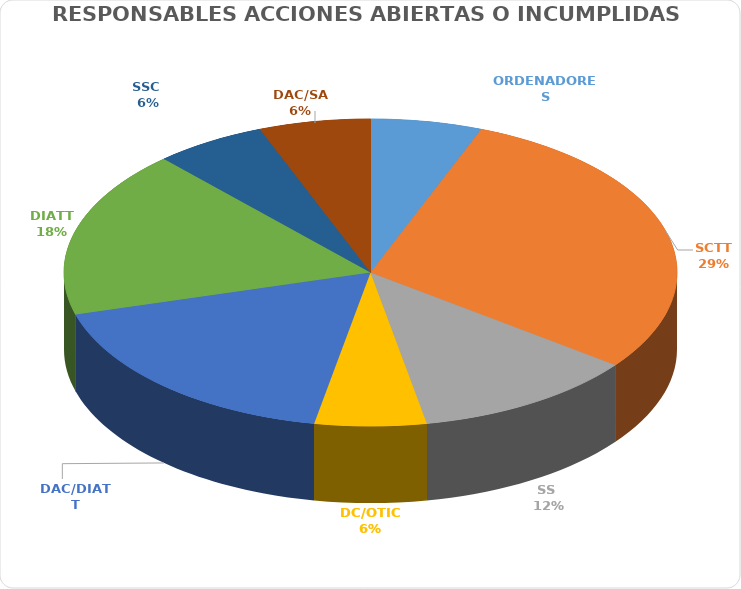
| Category | Series 0 |
|---|---|
| ORDENADORES | 1 |
| SCTT | 5 |
| SS  | 2 |
| DC/OTIC | 1 |
| DAC/DIATT | 3 |
| DIATT | 3 |
| SSC  | 1 |
| DAC/SA | 1 |